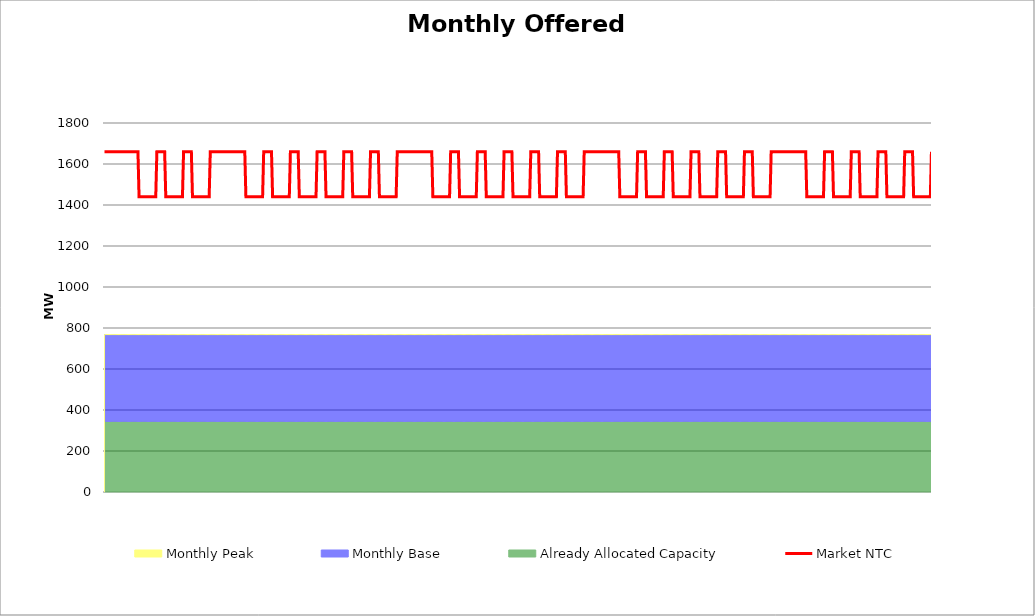
| Category | Market NTC |
|---|---|
| 0 | 1660 |
| 1 | 1660 |
| 2 | 1660 |
| 3 | 1660 |
| 4 | 1660 |
| 5 | 1660 |
| 6 | 1660 |
| 7 | 1660 |
| 8 | 1660 |
| 9 | 1660 |
| 10 | 1660 |
| 11 | 1660 |
| 12 | 1660 |
| 13 | 1660 |
| 14 | 1660 |
| 15 | 1660 |
| 16 | 1660 |
| 17 | 1660 |
| 18 | 1660 |
| 19 | 1660 |
| 20 | 1660 |
| 21 | 1660 |
| 22 | 1660 |
| 23 | 1660 |
| 24 | 1660 |
| 25 | 1660 |
| 26 | 1660 |
| 27 | 1660 |
| 28 | 1660 |
| 29 | 1660 |
| 30 | 1660 |
| 31 | 1440 |
| 32 | 1440 |
| 33 | 1440 |
| 34 | 1440 |
| 35 | 1440 |
| 36 | 1440 |
| 37 | 1440 |
| 38 | 1440 |
| 39 | 1440 |
| 40 | 1440 |
| 41 | 1440 |
| 42 | 1440 |
| 43 | 1440 |
| 44 | 1440 |
| 45 | 1440 |
| 46 | 1440 |
| 47 | 1660 |
| 48 | 1660 |
| 49 | 1660 |
| 50 | 1660 |
| 51 | 1660 |
| 52 | 1660 |
| 53 | 1660 |
| 54 | 1660 |
| 55 | 1440 |
| 56 | 1440 |
| 57 | 1440 |
| 58 | 1440 |
| 59 | 1440 |
| 60 | 1440 |
| 61 | 1440 |
| 62 | 1440 |
| 63 | 1440 |
| 64 | 1440 |
| 65 | 1440 |
| 66 | 1440 |
| 67 | 1440 |
| 68 | 1440 |
| 69 | 1440 |
| 70 | 1440 |
| 71 | 1660 |
| 72 | 1660 |
| 73 | 1660 |
| 74 | 1660 |
| 75 | 1660 |
| 76 | 1660 |
| 77 | 1660 |
| 78 | 1660 |
| 79 | 1440 |
| 80 | 1440 |
| 81 | 1440 |
| 82 | 1440 |
| 83 | 1440 |
| 84 | 1440 |
| 85 | 1440 |
| 86 | 1440 |
| 87 | 1440 |
| 88 | 1440 |
| 89 | 1440 |
| 90 | 1440 |
| 91 | 1440 |
| 92 | 1440 |
| 93 | 1440 |
| 94 | 1440 |
| 95 | 1660 |
| 96 | 1660 |
| 97 | 1660 |
| 98 | 1660 |
| 99 | 1660 |
| 100 | 1660 |
| 101 | 1660 |
| 102 | 1660 |
| 103 | 1660 |
| 104 | 1660 |
| 105 | 1660 |
| 106 | 1660 |
| 107 | 1660 |
| 108 | 1660 |
| 109 | 1660 |
| 110 | 1660 |
| 111 | 1660 |
| 112 | 1660 |
| 113 | 1660 |
| 114 | 1660 |
| 115 | 1660 |
| 116 | 1660 |
| 117 | 1660 |
| 118 | 1660 |
| 119 | 1660 |
| 120 | 1660 |
| 121 | 1660 |
| 122 | 1660 |
| 123 | 1660 |
| 124 | 1660 |
| 125 | 1660 |
| 126 | 1660 |
| 127 | 1440 |
| 128 | 1440 |
| 129 | 1440 |
| 130 | 1440 |
| 131 | 1440 |
| 132 | 1440 |
| 133 | 1440 |
| 134 | 1440 |
| 135 | 1440 |
| 136 | 1440 |
| 137 | 1440 |
| 138 | 1440 |
| 139 | 1440 |
| 140 | 1440 |
| 141 | 1440 |
| 142 | 1440 |
| 143 | 1660 |
| 144 | 1660 |
| 145 | 1660 |
| 146 | 1660 |
| 147 | 1660 |
| 148 | 1660 |
| 149 | 1660 |
| 150 | 1660 |
| 151 | 1440 |
| 152 | 1440 |
| 153 | 1440 |
| 154 | 1440 |
| 155 | 1440 |
| 156 | 1440 |
| 157 | 1440 |
| 158 | 1440 |
| 159 | 1440 |
| 160 | 1440 |
| 161 | 1440 |
| 162 | 1440 |
| 163 | 1440 |
| 164 | 1440 |
| 165 | 1440 |
| 166 | 1440 |
| 167 | 1660 |
| 168 | 1660 |
| 169 | 1660 |
| 170 | 1660 |
| 171 | 1660 |
| 172 | 1660 |
| 173 | 1660 |
| 174 | 1660 |
| 175 | 1440 |
| 176 | 1440 |
| 177 | 1440 |
| 178 | 1440 |
| 179 | 1440 |
| 180 | 1440 |
| 181 | 1440 |
| 182 | 1440 |
| 183 | 1440 |
| 184 | 1440 |
| 185 | 1440 |
| 186 | 1440 |
| 187 | 1440 |
| 188 | 1440 |
| 189 | 1440 |
| 190 | 1440 |
| 191 | 1660 |
| 192 | 1660 |
| 193 | 1660 |
| 194 | 1660 |
| 195 | 1660 |
| 196 | 1660 |
| 197 | 1660 |
| 198 | 1660 |
| 199 | 1440 |
| 200 | 1440 |
| 201 | 1440 |
| 202 | 1440 |
| 203 | 1440 |
| 204 | 1440 |
| 205 | 1440 |
| 206 | 1440 |
| 207 | 1440 |
| 208 | 1440 |
| 209 | 1440 |
| 210 | 1440 |
| 211 | 1440 |
| 212 | 1440 |
| 213 | 1440 |
| 214 | 1440 |
| 215 | 1660 |
| 216 | 1660 |
| 217 | 1660 |
| 218 | 1660 |
| 219 | 1660 |
| 220 | 1660 |
| 221 | 1660 |
| 222 | 1660 |
| 223 | 1440 |
| 224 | 1440 |
| 225 | 1440 |
| 226 | 1440 |
| 227 | 1440 |
| 228 | 1440 |
| 229 | 1440 |
| 230 | 1440 |
| 231 | 1440 |
| 232 | 1440 |
| 233 | 1440 |
| 234 | 1440 |
| 235 | 1440 |
| 236 | 1440 |
| 237 | 1440 |
| 238 | 1440 |
| 239 | 1660 |
| 240 | 1660 |
| 241 | 1660 |
| 242 | 1660 |
| 243 | 1660 |
| 244 | 1660 |
| 245 | 1660 |
| 246 | 1660 |
| 247 | 1440 |
| 248 | 1440 |
| 249 | 1440 |
| 250 | 1440 |
| 251 | 1440 |
| 252 | 1440 |
| 253 | 1440 |
| 254 | 1440 |
| 255 | 1440 |
| 256 | 1440 |
| 257 | 1440 |
| 258 | 1440 |
| 259 | 1440 |
| 260 | 1440 |
| 261 | 1440 |
| 262 | 1440 |
| 263 | 1660 |
| 264 | 1660 |
| 265 | 1660 |
| 266 | 1660 |
| 267 | 1660 |
| 268 | 1660 |
| 269 | 1660 |
| 270 | 1660 |
| 271 | 1660 |
| 272 | 1660 |
| 273 | 1660 |
| 274 | 1660 |
| 275 | 1660 |
| 276 | 1660 |
| 277 | 1660 |
| 278 | 1660 |
| 279 | 1660 |
| 280 | 1660 |
| 281 | 1660 |
| 282 | 1660 |
| 283 | 1660 |
| 284 | 1660 |
| 285 | 1660 |
| 286 | 1660 |
| 287 | 1660 |
| 288 | 1660 |
| 289 | 1660 |
| 290 | 1660 |
| 291 | 1660 |
| 292 | 1660 |
| 293 | 1660 |
| 294 | 1660 |
| 295 | 1440 |
| 296 | 1440 |
| 297 | 1440 |
| 298 | 1440 |
| 299 | 1440 |
| 300 | 1440 |
| 301 | 1440 |
| 302 | 1440 |
| 303 | 1440 |
| 304 | 1440 |
| 305 | 1440 |
| 306 | 1440 |
| 307 | 1440 |
| 308 | 1440 |
| 309 | 1440 |
| 310 | 1440 |
| 311 | 1660 |
| 312 | 1660 |
| 313 | 1660 |
| 314 | 1660 |
| 315 | 1660 |
| 316 | 1660 |
| 317 | 1660 |
| 318 | 1660 |
| 319 | 1440 |
| 320 | 1440 |
| 321 | 1440 |
| 322 | 1440 |
| 323 | 1440 |
| 324 | 1440 |
| 325 | 1440 |
| 326 | 1440 |
| 327 | 1440 |
| 328 | 1440 |
| 329 | 1440 |
| 330 | 1440 |
| 331 | 1440 |
| 332 | 1440 |
| 333 | 1440 |
| 334 | 1440 |
| 335 | 1660 |
| 336 | 1660 |
| 337 | 1660 |
| 338 | 1660 |
| 339 | 1660 |
| 340 | 1660 |
| 341 | 1660 |
| 342 | 1660 |
| 343 | 1440 |
| 344 | 1440 |
| 345 | 1440 |
| 346 | 1440 |
| 347 | 1440 |
| 348 | 1440 |
| 349 | 1440 |
| 350 | 1440 |
| 351 | 1440 |
| 352 | 1440 |
| 353 | 1440 |
| 354 | 1440 |
| 355 | 1440 |
| 356 | 1440 |
| 357 | 1440 |
| 358 | 1440 |
| 359 | 1660 |
| 360 | 1660 |
| 361 | 1660 |
| 362 | 1660 |
| 363 | 1660 |
| 364 | 1660 |
| 365 | 1660 |
| 366 | 1660 |
| 367 | 1440 |
| 368 | 1440 |
| 369 | 1440 |
| 370 | 1440 |
| 371 | 1440 |
| 372 | 1440 |
| 373 | 1440 |
| 374 | 1440 |
| 375 | 1440 |
| 376 | 1440 |
| 377 | 1440 |
| 378 | 1440 |
| 379 | 1440 |
| 380 | 1440 |
| 381 | 1440 |
| 382 | 1440 |
| 383 | 1660 |
| 384 | 1660 |
| 385 | 1660 |
| 386 | 1660 |
| 387 | 1660 |
| 388 | 1660 |
| 389 | 1660 |
| 390 | 1660 |
| 391 | 1440 |
| 392 | 1440 |
| 393 | 1440 |
| 394 | 1440 |
| 395 | 1440 |
| 396 | 1440 |
| 397 | 1440 |
| 398 | 1440 |
| 399 | 1440 |
| 400 | 1440 |
| 401 | 1440 |
| 402 | 1440 |
| 403 | 1440 |
| 404 | 1440 |
| 405 | 1440 |
| 406 | 1440 |
| 407 | 1660 |
| 408 | 1660 |
| 409 | 1660 |
| 410 | 1660 |
| 411 | 1660 |
| 412 | 1660 |
| 413 | 1660 |
| 414 | 1660 |
| 415 | 1440 |
| 416 | 1440 |
| 417 | 1440 |
| 418 | 1440 |
| 419 | 1440 |
| 420 | 1440 |
| 421 | 1440 |
| 422 | 1440 |
| 423 | 1440 |
| 424 | 1440 |
| 425 | 1440 |
| 426 | 1440 |
| 427 | 1440 |
| 428 | 1440 |
| 429 | 1440 |
| 430 | 1440 |
| 431 | 1660 |
| 432 | 1660 |
| 433 | 1660 |
| 434 | 1660 |
| 435 | 1660 |
| 436 | 1660 |
| 437 | 1660 |
| 438 | 1660 |
| 439 | 1660 |
| 440 | 1660 |
| 441 | 1660 |
| 442 | 1660 |
| 443 | 1660 |
| 444 | 1660 |
| 445 | 1660 |
| 446 | 1660 |
| 447 | 1660 |
| 448 | 1660 |
| 449 | 1660 |
| 450 | 1660 |
| 451 | 1660 |
| 452 | 1660 |
| 453 | 1660 |
| 454 | 1660 |
| 455 | 1660 |
| 456 | 1660 |
| 457 | 1660 |
| 458 | 1660 |
| 459 | 1660 |
| 460 | 1660 |
| 461 | 1660 |
| 462 | 1660 |
| 463 | 1440 |
| 464 | 1440 |
| 465 | 1440 |
| 466 | 1440 |
| 467 | 1440 |
| 468 | 1440 |
| 469 | 1440 |
| 470 | 1440 |
| 471 | 1440 |
| 472 | 1440 |
| 473 | 1440 |
| 474 | 1440 |
| 475 | 1440 |
| 476 | 1440 |
| 477 | 1440 |
| 478 | 1440 |
| 479 | 1660 |
| 480 | 1660 |
| 481 | 1660 |
| 482 | 1660 |
| 483 | 1660 |
| 484 | 1660 |
| 485 | 1660 |
| 486 | 1660 |
| 487 | 1440 |
| 488 | 1440 |
| 489 | 1440 |
| 490 | 1440 |
| 491 | 1440 |
| 492 | 1440 |
| 493 | 1440 |
| 494 | 1440 |
| 495 | 1440 |
| 496 | 1440 |
| 497 | 1440 |
| 498 | 1440 |
| 499 | 1440 |
| 500 | 1440 |
| 501 | 1440 |
| 502 | 1440 |
| 503 | 1660 |
| 504 | 1660 |
| 505 | 1660 |
| 506 | 1660 |
| 507 | 1660 |
| 508 | 1660 |
| 509 | 1660 |
| 510 | 1660 |
| 511 | 1440 |
| 512 | 1440 |
| 513 | 1440 |
| 514 | 1440 |
| 515 | 1440 |
| 516 | 1440 |
| 517 | 1440 |
| 518 | 1440 |
| 519 | 1440 |
| 520 | 1440 |
| 521 | 1440 |
| 522 | 1440 |
| 523 | 1440 |
| 524 | 1440 |
| 525 | 1440 |
| 526 | 1440 |
| 527 | 1660 |
| 528 | 1660 |
| 529 | 1660 |
| 530 | 1660 |
| 531 | 1660 |
| 532 | 1660 |
| 533 | 1660 |
| 534 | 1660 |
| 535 | 1440 |
| 536 | 1440 |
| 537 | 1440 |
| 538 | 1440 |
| 539 | 1440 |
| 540 | 1440 |
| 541 | 1440 |
| 542 | 1440 |
| 543 | 1440 |
| 544 | 1440 |
| 545 | 1440 |
| 546 | 1440 |
| 547 | 1440 |
| 548 | 1440 |
| 549 | 1440 |
| 550 | 1440 |
| 551 | 1660 |
| 552 | 1660 |
| 553 | 1660 |
| 554 | 1660 |
| 555 | 1660 |
| 556 | 1660 |
| 557 | 1660 |
| 558 | 1660 |
| 559 | 1440 |
| 560 | 1440 |
| 561 | 1440 |
| 562 | 1440 |
| 563 | 1440 |
| 564 | 1440 |
| 565 | 1440 |
| 566 | 1440 |
| 567 | 1440 |
| 568 | 1440 |
| 569 | 1440 |
| 570 | 1440 |
| 571 | 1440 |
| 572 | 1440 |
| 573 | 1440 |
| 574 | 1440 |
| 575 | 1660 |
| 576 | 1660 |
| 577 | 1660 |
| 578 | 1660 |
| 579 | 1660 |
| 580 | 1660 |
| 581 | 1660 |
| 582 | 1660 |
| 583 | 1440 |
| 584 | 1440 |
| 585 | 1440 |
| 586 | 1440 |
| 587 | 1440 |
| 588 | 1440 |
| 589 | 1440 |
| 590 | 1440 |
| 591 | 1440 |
| 592 | 1440 |
| 593 | 1440 |
| 594 | 1440 |
| 595 | 1440 |
| 596 | 1440 |
| 597 | 1440 |
| 598 | 1440 |
| 599 | 1660 |
| 600 | 1660 |
| 601 | 1660 |
| 602 | 1660 |
| 603 | 1660 |
| 604 | 1660 |
| 605 | 1660 |
| 606 | 1660 |
| 607 | 1660 |
| 608 | 1660 |
| 609 | 1660 |
| 610 | 1660 |
| 611 | 1660 |
| 612 | 1660 |
| 613 | 1660 |
| 614 | 1660 |
| 615 | 1660 |
| 616 | 1660 |
| 617 | 1660 |
| 618 | 1660 |
| 619 | 1660 |
| 620 | 1660 |
| 621 | 1660 |
| 622 | 1660 |
| 623 | 1660 |
| 624 | 1660 |
| 625 | 1660 |
| 626 | 1660 |
| 627 | 1660 |
| 628 | 1660 |
| 629 | 1660 |
| 630 | 1660 |
| 631 | 1440 |
| 632 | 1440 |
| 633 | 1440 |
| 634 | 1440 |
| 635 | 1440 |
| 636 | 1440 |
| 637 | 1440 |
| 638 | 1440 |
| 639 | 1440 |
| 640 | 1440 |
| 641 | 1440 |
| 642 | 1440 |
| 643 | 1440 |
| 644 | 1440 |
| 645 | 1440 |
| 646 | 1440 |
| 647 | 1660 |
| 648 | 1660 |
| 649 | 1660 |
| 650 | 1660 |
| 651 | 1660 |
| 652 | 1660 |
| 653 | 1660 |
| 654 | 1660 |
| 655 | 1440 |
| 656 | 1440 |
| 657 | 1440 |
| 658 | 1440 |
| 659 | 1440 |
| 660 | 1440 |
| 661 | 1440 |
| 662 | 1440 |
| 663 | 1440 |
| 664 | 1440 |
| 665 | 1440 |
| 666 | 1440 |
| 667 | 1440 |
| 668 | 1440 |
| 669 | 1440 |
| 670 | 1440 |
| 671 | 1660 |
| 672 | 1660 |
| 673 | 1660 |
| 674 | 1660 |
| 675 | 1660 |
| 676 | 1660 |
| 677 | 1660 |
| 678 | 1660 |
| 679 | 1440 |
| 680 | 1440 |
| 681 | 1440 |
| 682 | 1440 |
| 683 | 1440 |
| 684 | 1440 |
| 685 | 1440 |
| 686 | 1440 |
| 687 | 1440 |
| 688 | 1440 |
| 689 | 1440 |
| 690 | 1440 |
| 691 | 1440 |
| 692 | 1440 |
| 693 | 1440 |
| 694 | 1440 |
| 695 | 1660 |
| 696 | 1660 |
| 697 | 1660 |
| 698 | 1660 |
| 699 | 1660 |
| 700 | 1660 |
| 701 | 1660 |
| 702 | 1660 |
| 703 | 1440 |
| 704 | 1440 |
| 705 | 1440 |
| 706 | 1440 |
| 707 | 1440 |
| 708 | 1440 |
| 709 | 1440 |
| 710 | 1440 |
| 711 | 1440 |
| 712 | 1440 |
| 713 | 1440 |
| 714 | 1440 |
| 715 | 1440 |
| 716 | 1440 |
| 717 | 1440 |
| 718 | 1440 |
| 719 | 1660 |
| 720 | 1660 |
| 721 | 1660 |
| 722 | 1660 |
| 723 | 1660 |
| 724 | 1660 |
| 725 | 1660 |
| 726 | 1660 |
| 727 | 1440 |
| 728 | 1440 |
| 729 | 1440 |
| 730 | 1440 |
| 731 | 1440 |
| 732 | 1440 |
| 733 | 1440 |
| 734 | 1440 |
| 735 | 1440 |
| 736 | 1440 |
| 737 | 1440 |
| 738 | 1440 |
| 739 | 1440 |
| 740 | 1440 |
| 741 | 1440 |
| 742 | 1440 |
| 743 | 1660 |